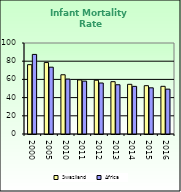
| Category | Swaziland | Africa |
|---|---|---|
| 2000.0 | 76.2 | 87.462 |
| 2005.0 | 78.5 | 73.418 |
| 2010.0 | 65.1 | 60.345 |
| 2011.0 | 59.4 | 58.107 |
| 2012.0 | 59.1 | 56.032 |
| 2013.0 | 57.5 | 54.131 |
| 2014.0 | 54.6 | 52.336 |
| 2015.0 | 53.1 | 50.754 |
| 2016.0 | 52.4 | 49.283 |